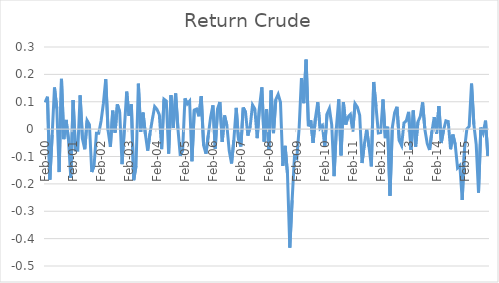
| Category | Series 0 |
|---|---|
| 2000-02-01 | 0.098 |
| 2000-03-01 | 0.118 |
| 2000-04-01 | -0.184 |
| 2000-05-01 | -0.021 |
| 2000-06-01 | 0.152 |
| 2000-07-01 | 0.076 |
| 2000-08-01 | -0.157 |
| 2000-09-01 | 0.184 |
| 2000-10-01 | -0.037 |
| 2000-11-01 | 0.034 |
| 2000-12-01 | -0.038 |
| 2001-01-01 | -0.178 |
| 2001-02-01 | 0.106 |
| 2001-03-01 | -0.077 |
| 2001-04-01 | -0.077 |
| 2001-05-01 | 0.123 |
| 2001-06-01 | -0.035 |
| 2001-07-01 | -0.074 |
| 2001-08-01 | 0.031 |
| 2001-09-01 | 0.017 |
| 2001-10-01 | -0.157 |
| 2001-11-01 | -0.133 |
| 2001-12-01 | -0.015 |
| 2002-01-01 | -0.015 |
| 2002-02-01 | 0.03 |
| 2002-03-01 | 0.095 |
| 2002-04-01 | 0.182 |
| 2002-05-01 | -0.005 |
| 2002-06-01 | -0.064 |
| 2002-07-01 | 0.067 |
| 2002-08-01 | -0.013 |
| 2002-09-01 | 0.09 |
| 2002-10-01 | 0.062 |
| 2002-11-01 | -0.128 |
| 2002-12-01 | 0.004 |
| 2003-01-01 | 0.137 |
| 2003-02-01 | 0.048 |
| 2003-03-01 | 0.09 |
| 2003-04-01 | -0.186 |
| 2003-05-01 | -0.135 |
| 2003-06-01 | 0.166 |
| 2003-07-01 | -0.01 |
| 2003-08-01 | 0.061 |
| 2003-09-01 | -0.017 |
| 2003-10-01 | -0.079 |
| 2003-11-01 | -0.015 |
| 2003-12-01 | 0.036 |
| 2004-01-01 | 0.082 |
| 2004-02-01 | 0.072 |
| 2004-03-01 | 0.053 |
| 2004-04-01 | -0.073 |
| 2004-05-01 | 0.109 |
| 2004-06-01 | 0.102 |
| 2004-07-01 | -0.089 |
| 2004-08-01 | 0.124 |
| 2004-09-01 | 0.004 |
| 2004-10-01 | 0.13 |
| 2004-11-01 | 0 |
| 2004-12-01 | -0.097 |
| 2005-01-01 | -0.077 |
| 2005-02-01 | 0.112 |
| 2005-03-01 | 0.092 |
| 2005-04-01 | 0.103 |
| 2005-05-01 | -0.117 |
| 2005-06-01 | 0.07 |
| 2005-07-01 | 0.073 |
| 2005-08-01 | 0.047 |
| 2005-09-01 | 0.121 |
| 2005-10-01 | -0.059 |
| 2005-11-01 | -0.09 |
| 2005-12-01 | -0.023 |
| 2006-01-01 | 0.043 |
| 2006-02-01 | 0.087 |
| 2006-03-01 | -0.071 |
| 2006-04-01 | 0.074 |
| 2006-05-01 | 0.099 |
| 2006-06-01 | -0.047 |
| 2006-07-01 | 0.05 |
| 2006-08-01 | 0.013 |
| 2006-09-01 | -0.079 |
| 2006-10-01 | -0.125 |
| 2006-11-01 | -0.039 |
| 2006-12-01 | 0.077 |
| 2007-01-01 | -0.038 |
| 2007-02-01 | -0.063 |
| 2007-03-01 | 0.079 |
| 2007-04-01 | 0.062 |
| 2007-05-01 | -0.024 |
| 2007-06-01 | 0.011 |
| 2007-07-01 | 0.088 |
| 2007-08-01 | 0.074 |
| 2007-09-01 | -0.033 |
| 2007-10-01 | 0.08 |
| 2007-11-01 | 0.153 |
| 2007-12-01 | -0.046 |
| 2008-01-01 | 0.072 |
| 2008-02-01 | -0.076 |
| 2008-03-01 | 0.141 |
| 2008-04-01 | -0.015 |
| 2008-05-01 | 0.108 |
| 2008-06-01 | 0.127 |
| 2008-07-01 | 0.098 |
| 2008-08-01 | -0.134 |
| 2008-09-01 | -0.061 |
| 2008-10-01 | -0.163 |
| 2008-11-01 | -0.433 |
| 2008-12-01 | -0.26 |
| 2009-01-01 | -0.1 |
| 2009-02-01 | -0.107 |
| 2009-03-01 | 0.002 |
| 2009-04-01 | 0.187 |
| 2009-05-01 | 0.095 |
| 2009-06-01 | 0.254 |
| 2009-07-01 | 0.011 |
| 2009-08-01 | 0.032 |
| 2009-09-01 | -0.051 |
| 2009-10-01 | 0.04 |
| 2009-11-01 | 0.098 |
| 2009-12-01 | 0.003 |
| 2010-01-01 | 0.013 |
| 2010-02-01 | -0.064 |
| 2010-03-01 | 0.056 |
| 2010-04-01 | 0.075 |
| 2010-05-01 | 0.015 |
| 2010-06-01 | -0.172 |
| 2010-07-01 | 0.005 |
| 2010-08-01 | 0.109 |
| 2010-09-01 | -0.096 |
| 2010-10-01 | 0.099 |
| 2010-11-01 | 0.017 |
| 2010-12-01 | 0.045 |
| 2011-01-01 | 0.054 |
| 2011-02-01 | -0.009 |
| 2011-03-01 | 0.093 |
| 2011-04-01 | 0.08 |
| 2011-05-01 | 0.05 |
| 2011-06-01 | -0.124 |
| 2011-07-01 | -0.055 |
| 2011-08-01 | -0.001 |
| 2011-09-01 | -0.065 |
| 2011-10-01 | -0.136 |
| 2011-11-01 | 0.172 |
| 2011-12-01 | 0.083 |
| 2012-01-01 | -0.014 |
| 2012-02-01 | -0.012 |
| 2012-03-01 | 0.108 |
| 2012-04-01 | -0.033 |
| 2012-05-01 | 0.009 |
| 2012-06-01 | -0.243 |
| 2012-07-01 | 0.006 |
| 2012-08-01 | 0.06 |
| 2012-09-01 | 0.082 |
| 2012-10-01 | -0.042 |
| 2012-11-01 | -0.06 |
| 2012-12-01 | 0.023 |
| 2013-01-01 | 0.03 |
| 2013-02-01 | 0.063 |
| 2013-03-01 | -0.075 |
| 2013-04-01 | 0.068 |
| 2013-05-01 | -0.064 |
| 2013-06-01 | 0.026 |
| 2013-07-01 | 0.046 |
| 2013-08-01 | 0.098 |
| 2013-09-01 | -0.003 |
| 2013-10-01 | -0.053 |
| 2013-11-01 | -0.076 |
| 2013-12-01 | -0.008 |
| 2014-01-01 | 0.044 |
| 2014-02-01 | -0.017 |
| 2014-03-01 | 0.084 |
| 2014-04-01 | -0.051 |
| 2014-05-01 | -0.003 |
| 2014-06-01 | 0.03 |
| 2014-07-01 | 0.028 |
| 2014-08-01 | -0.073 |
| 2014-09-01 | -0.02 |
| 2014-10-01 | -0.056 |
| 2014-11-01 | -0.141 |
| 2014-12-01 | -0.133 |
| 2015-01-01 | -0.259 |
| 2015-02-01 | -0.072 |
| 2015-03-01 | 0 |
| 2015-04-01 | 0.01 |
| 2015-05-01 | 0.166 |
| 2015-06-01 | 0.018 |
| 2015-07-01 | -0.055 |
| 2015-08-01 | -0.232 |
| 2015-09-01 | 0.005 |
| 2015-10-01 | -0.015 |
| 2015-11-01 | 0.031 |
| 2015-12-01 | -0.098 |